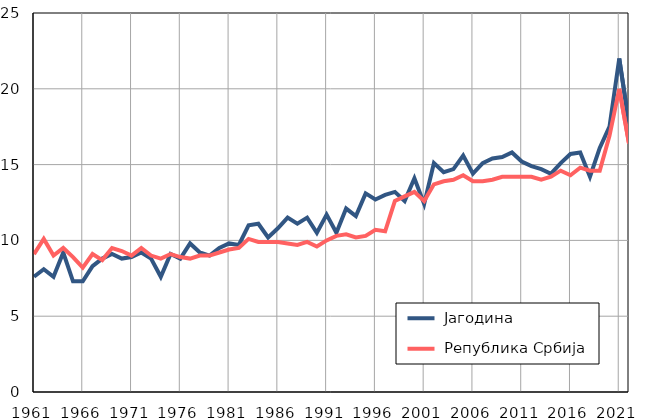
| Category |  Јагодина |  Република Србија |
|---|---|---|
| 1961.0 | 7.6 | 9.1 |
| 1962.0 | 8.1 | 10.1 |
| 1963.0 | 7.6 | 9 |
| 1964.0 | 9.2 | 9.5 |
| 1965.0 | 7.3 | 8.9 |
| 1966.0 | 7.3 | 8.2 |
| 1967.0 | 8.3 | 9.1 |
| 1968.0 | 8.8 | 8.7 |
| 1969.0 | 9.1 | 9.5 |
| 1970.0 | 8.8 | 9.3 |
| 1971.0 | 8.9 | 9 |
| 1972.0 | 9.2 | 9.5 |
| 1973.0 | 8.8 | 9 |
| 1974.0 | 7.6 | 8.8 |
| 1975.0 | 9.1 | 9.1 |
| 1976.0 | 8.8 | 8.9 |
| 1977.0 | 9.8 | 8.8 |
| 1978.0 | 9.2 | 9 |
| 1979.0 | 9 | 9 |
| 1980.0 | 9.5 | 9.2 |
| 1981.0 | 9.8 | 9.4 |
| 1982.0 | 9.7 | 9.5 |
| 1983.0 | 11 | 10.1 |
| 1984.0 | 11.1 | 9.9 |
| 1985.0 | 10.2 | 9.9 |
| 1986.0 | 10.8 | 9.9 |
| 1987.0 | 11.5 | 9.8 |
| 1988.0 | 11.1 | 9.7 |
| 1989.0 | 11.5 | 9.9 |
| 1990.0 | 10.5 | 9.6 |
| 1991.0 | 11.7 | 10 |
| 1992.0 | 10.5 | 10.3 |
| 1993.0 | 12.1 | 10.4 |
| 1994.0 | 11.6 | 10.2 |
| 1995.0 | 13.1 | 10.3 |
| 1996.0 | 12.7 | 10.7 |
| 1997.0 | 13 | 10.6 |
| 1998.0 | 13.2 | 12.6 |
| 1999.0 | 12.6 | 12.9 |
| 2000.0 | 14.1 | 13.2 |
| 2001.0 | 12.4 | 12.6 |
| 2002.0 | 15.1 | 13.7 |
| 2003.0 | 14.5 | 13.9 |
| 2004.0 | 14.7 | 14 |
| 2005.0 | 15.6 | 14.3 |
| 2006.0 | 14.4 | 13.9 |
| 2007.0 | 15.1 | 13.9 |
| 2008.0 | 15.4 | 14 |
| 2009.0 | 15.5 | 14.2 |
| 2010.0 | 15.8 | 14.2 |
| 2011.0 | 15.2 | 14.2 |
| 2012.0 | 14.9 | 14.2 |
| 2013.0 | 14.7 | 14 |
| 2014.0 | 14.4 | 14.2 |
| 2015.0 | 15.1 | 14.6 |
| 2016.0 | 15.7 | 14.3 |
| 2017.0 | 15.8 | 14.8 |
| 2018.0 | 14.2 | 14.6 |
| 2019.0 | 16.1 | 14.6 |
| 2020.0 | 17.5 | 16.9 |
| 2021.0 | 22 | 20 |
| 2022.0 | 17.7 | 16.4 |